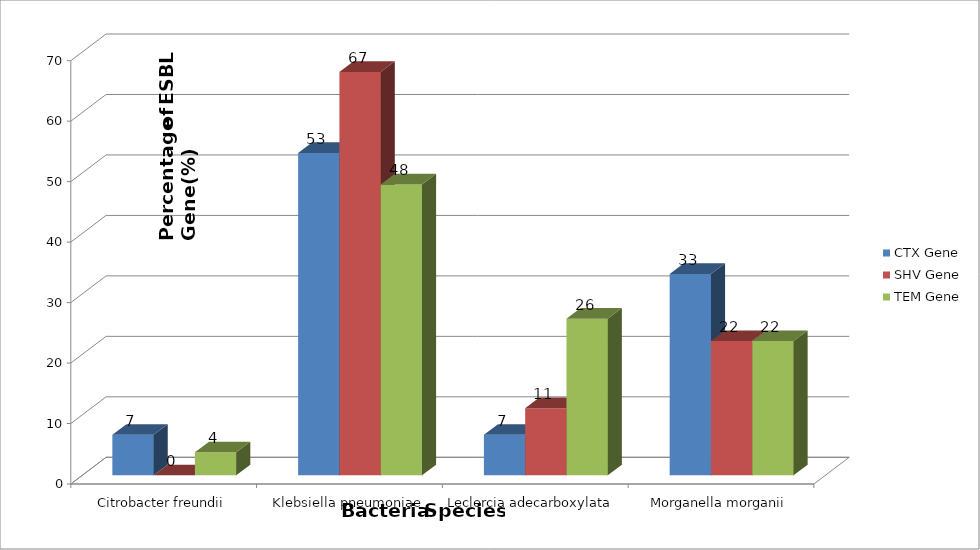
| Category | CTX Gene | SHV Gene | TEM Gene |
|---|---|---|---|
| Citrobacter freundii | 6.7 | 0 | 3.8 |
| Klebsiella pneumoniae | 53.3 | 66.7 | 48.1 |
| Leclercia adecarboxylata  | 6.7 | 11.1 | 25.9 |
| Morganella morganii | 33.3 | 22.2 | 22.2 |